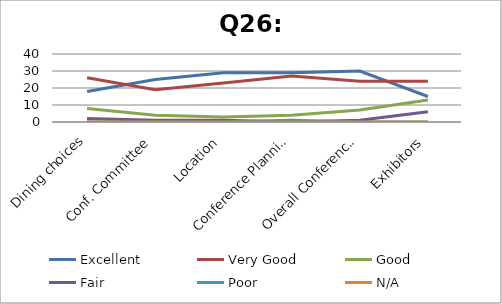
| Category | Excellent | Very Good | Good | Fair | Poor | N/A |
|---|---|---|---|---|---|---|
| Dining choices | 18 | 26 | 8 | 2 | 0 | 0 |
| Conf. Committee | 25 | 19 | 4 | 1 | 0 | 0 |
| Location | 29 | 23 | 3 | 1 | 0 | 0 |
| Conference Planning | 29 | 27 | 4 | 0 | 1 | 0 |
| Overall Conference Length | 30 | 24 | 7 | 1 | 0 | 0 |
| Exhibitors | 15 | 24 | 13 | 6 | 0 | 0 |